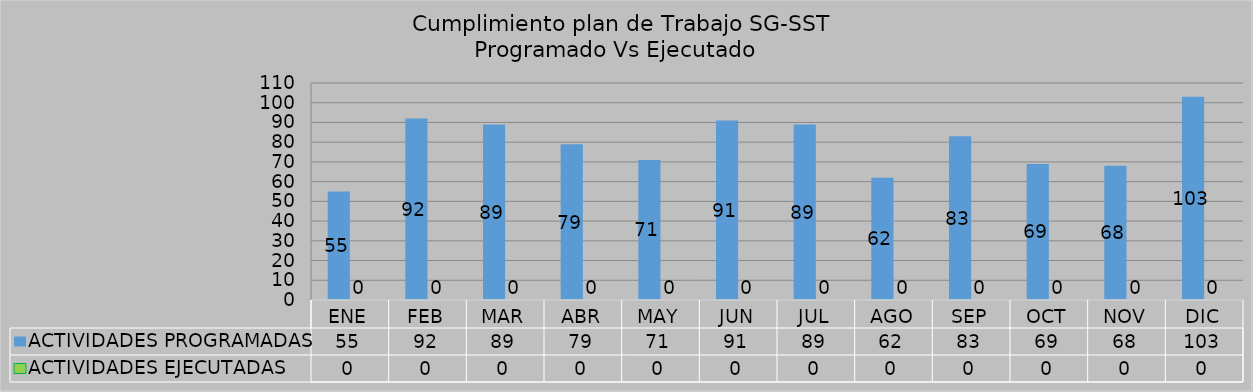
| Category | ACTIVIDADES PROGRAMADAS | ACTIVIDADES EJECUTADAS |
|---|---|---|
| ENE | 55 | 0 |
| FEB | 92 | 0 |
| MAR | 89 | 0 |
| ABR | 79 | 0 |
| MAY | 71 | 0 |
| JUN | 91 | 0 |
| JUL | 89 | 0 |
| AGO | 62 | 0 |
| SEP | 83 | 0 |
| OCT | 69 | 0 |
| NOV | 68 | 0 |
| DIC | 103 | 0 |